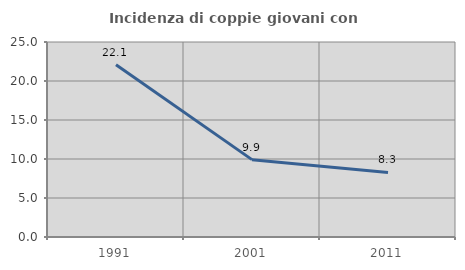
| Category | Incidenza di coppie giovani con figli |
|---|---|
| 1991.0 | 22.093 |
| 2001.0 | 9.917 |
| 2011.0 | 8.271 |